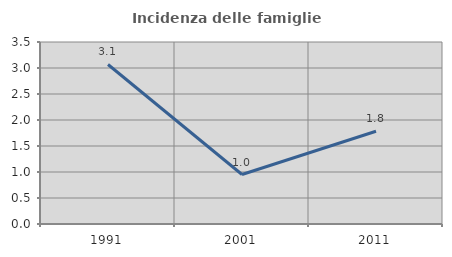
| Category | Incidenza delle famiglie numerose |
|---|---|
| 1991.0 | 3.068 |
| 2001.0 | 0.951 |
| 2011.0 | 1.784 |